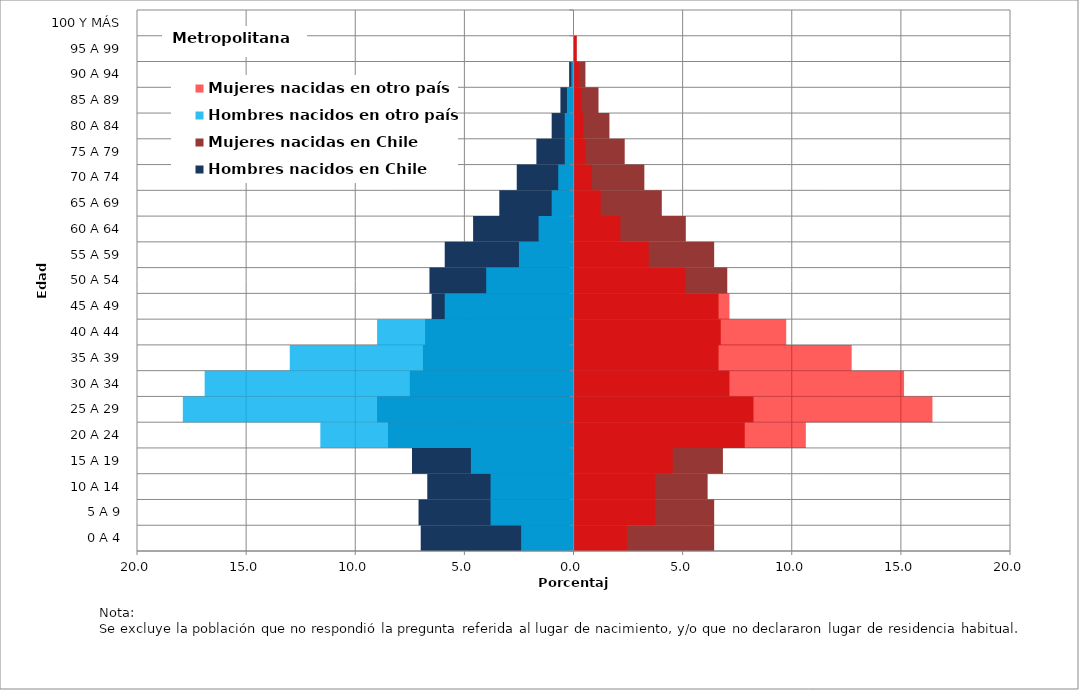
| Category | Hombres nacidos en Chile | Mujeres nacidas en Chile | Hombres nacidos en otro país | Mujeres nacidas en otro país |
|---|---|---|---|---|
| 0 A 4 | -7 | 6.4 | -2.4 | 2.4 |
| 5 A 9 | -7.1 | 6.4 | -3.8 | 3.7 |
| 10 A 14 | -6.7 | 6.1 | -3.8 | 3.7 |
| 15 A 19 | -7.4 | 6.8 | -4.7 | 4.5 |
| 20 A 24 | -8.5 | 7.8 | -11.6 | 10.6 |
| 25 A 29 | -9 | 8.2 | -17.9 | 16.4 |
| 30 A 34 | -7.5 | 7.1 | -16.9 | 15.1 |
| 35 A 39 | -6.9 | 6.6 | -13 | 12.7 |
| 40 A 44 | -6.8 | 6.7 | -9 | 9.7 |
| 45 A 49 | -6.5 | 6.6 | -5.9 | 7.1 |
| 50 A 54 | -6.6 | 7 | -4 | 5.1 |
| 55 A 59 | -5.9 | 6.4 | -2.5 | 3.4 |
| 60 A 64 | -4.6 | 5.1 | -1.6 | 2.1 |
| 65 A 69 | -3.4 | 4 | -1 | 1.2 |
| 70 A 74 | -2.6 | 3.2 | -0.7 | 0.8 |
| 75 A 79 | -1.7 | 2.3 | -0.4 | 0.5 |
| 80 A 84 | -1 | 1.6 | -0.4 | 0.4 |
| 85 A 89 | -0.6 | 1.1 | -0.3 | 0.3 |
| 90 A 94 | -0.2 | 0.5 | -0.1 | 0.2 |
| 95 A 99 | 0 | 0.1 | 0 | 0.1 |
| 100 Y MÁS | 0 | 0 | 0 | 0 |